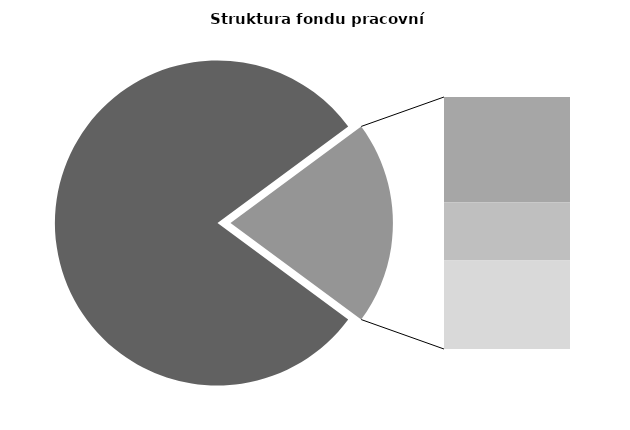
| Category | Series 0 |
|---|---|
| Průměrná měsíční odpracovaná doba bez přesčasu | 136.991 |
| Dovolená | 14.534 |
| Nemoc | 8.052 |
| Jiné | 12.207 |